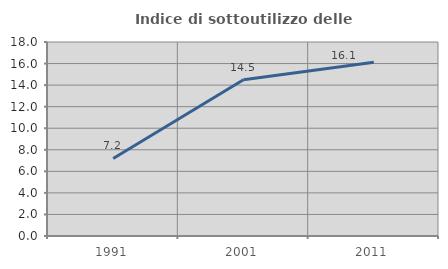
| Category | Indice di sottoutilizzo delle abitazioni  |
|---|---|
| 1991.0 | 7.197 |
| 2001.0 | 14.5 |
| 2011.0 | 16.121 |